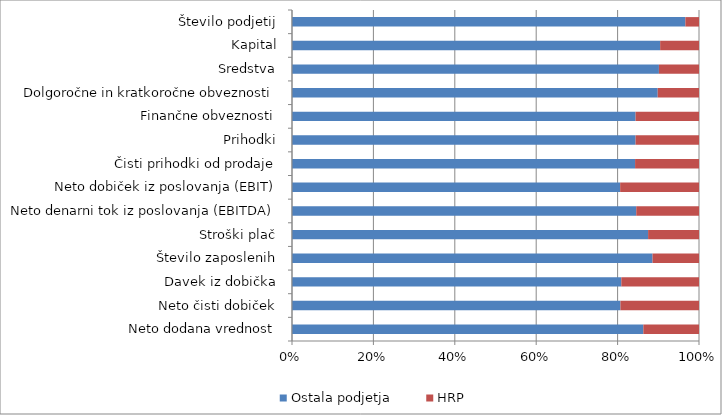
| Category | Ostala podjetja | HRP |
|---|---|---|
| Neto dodana vrednost | 28809703.431 | 4564889.792 |
| Neto čisti dobiček | 6074092.276 | 1453097.092 |
| Davek iz dobička | 1080259.172 | 254788.511 |
| Število zaposlenih | 554628.48 | 71486.99 |
| Stroški plač | 12276696.029 | 1754984.091 |
| Neto denarni tok iz poslovanja (EBITDA) | 12034786.066 | 2193886.069 |
| Neto dobiček iz poslovanja (EBIT) | 6728379.867 | 1616418.915 |
| Čisti prihodki od prodaje | 117091144.403 | 21815029.553 |
| Prihodki | 121107073.321 | 22357878.246 |
| Finančne obveznosti | 121107073.321 | 22357878.246 |
| Dolgoročne in kratkoročne obveznosti | 58582901.47 | 6615111.093 |
| Sredstva | 117302398.075 | 12810033.659 |
| Kapital | 58719649.276 | 6194922.602 |
| Število podjetij | 119632 | 4145 |